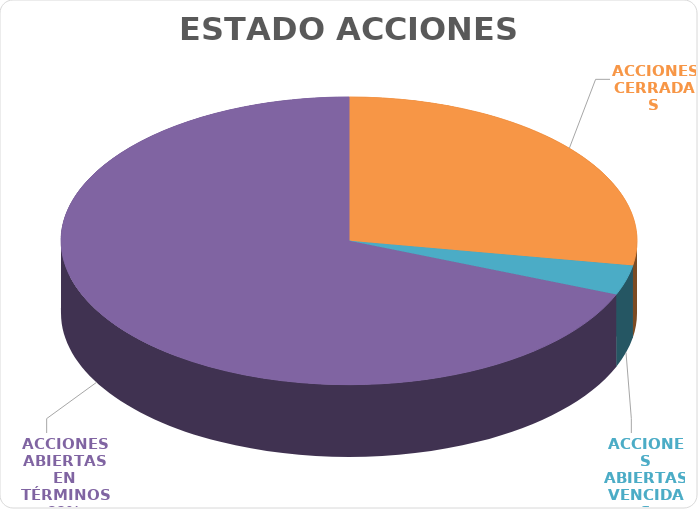
| Category | Series 0 |
|---|---|
| ACCIONES CERRADAS | 33 |
| ACCIONES ABIERTAS VENCIDAS | 4 |
| ACCIONES ABIERTAS EN TÉRMINOS | 82 |